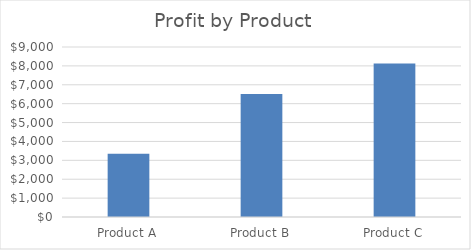
| Category | Series 0 |
|---|---|
| Product A | 3348 |
| Product B | 6516 |
| Product C | 8124 |